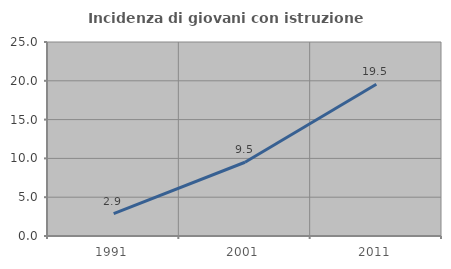
| Category | Incidenza di giovani con istruzione universitaria |
|---|---|
| 1991.0 | 2.885 |
| 2001.0 | 9.504 |
| 2011.0 | 19.549 |